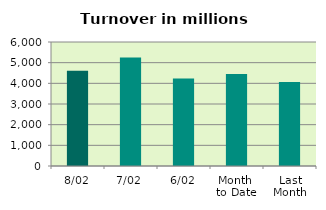
| Category | Series 0 |
|---|---|
| 8/02 | 4613.957 |
| 7/02 | 5249.258 |
| 6/02 | 4235.562 |
| Month 
to Date | 4451.451 |
| Last
Month | 4067.116 |